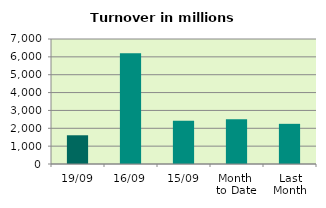
| Category | Series 0 |
|---|---|
| 19/09 | 1608.79 |
| 16/09 | 6204.612 |
| 15/09 | 2417.37 |
| Month 
to Date | 2511.061 |
| Last
Month | 2249.305 |